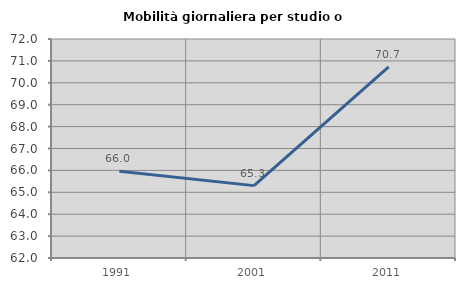
| Category | Mobilità giornaliera per studio o lavoro |
|---|---|
| 1991.0 | 65.958 |
| 2001.0 | 65.305 |
| 2011.0 | 70.73 |